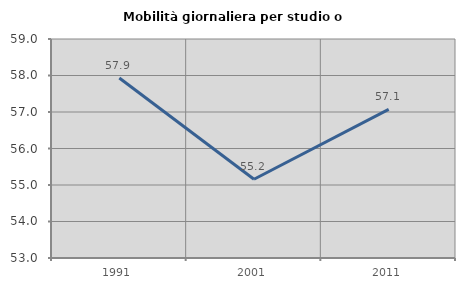
| Category | Mobilità giornaliera per studio o lavoro |
|---|---|
| 1991.0 | 57.931 |
| 2001.0 | 55.158 |
| 2011.0 | 57.071 |